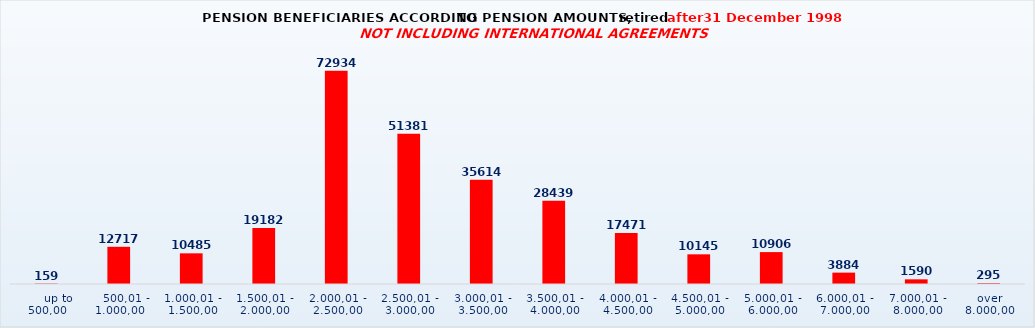
| Category | Series 0 |
|---|---|
|      up to 500,00 | 159 |
|    500,01 - 1.000,00 | 12717 |
| 1.000,01 - 1.500,00 | 10485 |
| 1.500,01 - 2.000,00 | 19182 |
| 2.000,01 - 2.500,00 | 72934 |
| 2.500,01 - 3.000,00 | 51381 |
| 3.000,01 - 3.500,00 | 35614 |
| 3.500,01 - 4.000,00 | 28439 |
| 4.000,01 - 4.500,00 | 17471 |
| 4.500,01 - 5.000,00 | 10145 |
| 5.000,01 - 6.000,00 | 10906 |
| 6.000,01 - 7.000,00 | 3884 |
| 7.000,01 - 8.000,00 | 1590 |
| over 8.000,00 | 295 |